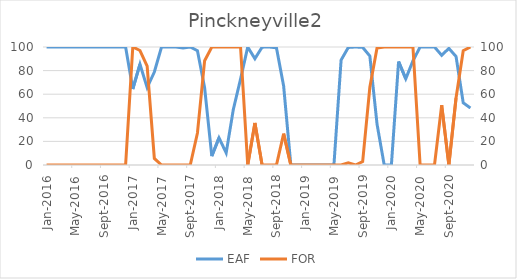
| Category | EAF |
|---|---|
| 2016-01-01 | 100 |
| 2016-02-01 | 100 |
| 2016-03-01 | 100 |
| 2016-04-01 | 100 |
| 2016-05-01 | 100 |
| 2016-06-01 | 100 |
| 2016-07-01 | 100 |
| 2016-08-01 | 100 |
| 2016-09-01 | 100 |
| 2016-10-01 | 100 |
| 2016-11-01 | 100 |
| 2016-12-01 | 100 |
| 2017-01-01 | 64.38 |
| 2017-02-01 | 85.42 |
| 2017-03-01 | 65.59 |
| 2017-04-01 | 78.8 |
| 2017-05-01 | 100 |
| 2017-06-01 | 100 |
| 2017-07-01 | 100 |
| 2017-08-01 | 99.21 |
| 2017-09-01 | 100 |
| 2017-10-01 | 96.79 |
| 2017-11-01 | 65.46 |
| 2017-12-01 | 7.54 |
| 2018-01-01 | 23.02 |
| 2018-02-01 | 10.28 |
| 2018-03-01 | 47.21 |
| 2018-04-01 | 72.79 |
| 2018-05-01 | 100 |
| 2018-06-01 | 90.09 |
| 2018-07-01 | 99.86 |
| 2018-08-01 | 100 |
| 2018-09-01 | 99.31 |
| 2018-10-01 | 66.93 |
| 2018-11-01 | 0 |
| 2018-12-01 | 0 |
| 2019-01-01 | 0 |
| 2019-02-01 | 0 |
| 2019-03-01 | 0 |
| 2019-04-01 | 0 |
| 2019-05-01 | 0 |
| 2019-06-01 | 88.95 |
| 2019-07-01 | 99.61 |
| 2019-08-01 | 100 |
| 2019-09-01 | 99.66 |
| 2019-10-01 | 92.36 |
| 2019-11-01 | 34.72 |
| 2019-12-01 | 0 |
| 2020-01-01 | 0 |
| 2020-02-01 | 87.68 |
| 2020-03-01 | 73.08 |
| 2020-04-01 | 88.28 |
| 2020-05-01 | 100 |
| 2020-06-01 | 100 |
| 2020-07-01 | 100 |
| 2020-08-01 | 92.97 |
| 2020-09-01 | 98.84 |
| 2020-10-01 | 91.96 |
| 2020-11-01 | 52.73 |
| 2020-12-01 | 48.3 |